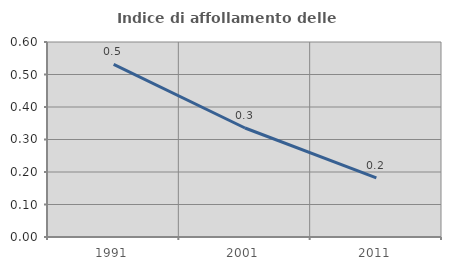
| Category | Indice di affollamento delle abitazioni  |
|---|---|
| 1991.0 | 0.531 |
| 2001.0 | 0.335 |
| 2011.0 | 0.182 |